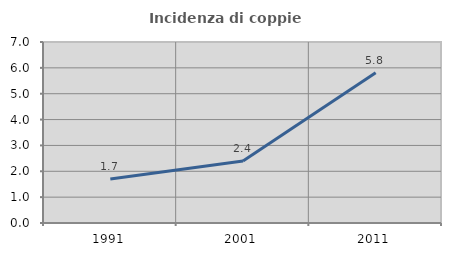
| Category | Incidenza di coppie miste |
|---|---|
| 1991.0 | 1.702 |
| 2001.0 | 2.4 |
| 2011.0 | 5.814 |